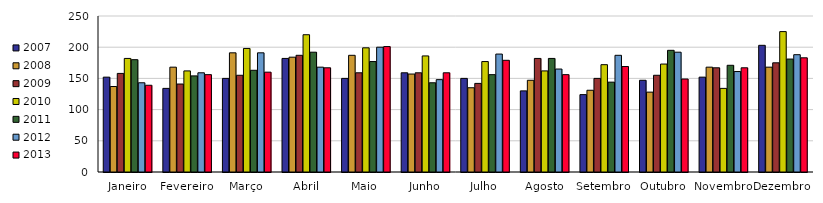
| Category | 2007 | 2008 | 2009 | 2010 | 2011 | 2012 | 2013 |
|---|---|---|---|---|---|---|---|
| Janeiro | 152 | 137 | 158 | 182 | 180 | 143 | 139 |
| Fevereiro | 134 | 168 | 141 | 162 | 154 | 159 | 156 |
| Março | 150 | 191 | 155 | 198 | 163 | 191 | 160 |
| Abril | 182 | 184 | 187 | 220 | 192 | 168 | 167 |
| Maio | 150 | 187 | 159 | 199 | 177 | 200 | 201 |
| Junho | 159 | 157 | 159 | 186 | 143 | 148 | 159 |
| Julho | 150 | 135 | 142 | 177 | 156 | 189 | 179 |
| Agosto | 130 | 147 | 182 | 162 | 182 | 165 | 156 |
| Setembro | 124 | 131 | 150 | 172 | 144 | 187 | 169 |
| Outubro | 147 | 128 | 155 | 173 | 195 | 192 | 149 |
| Novembro | 152 | 168 | 167 | 134 | 171 | 161 | 167 |
| Dezembro | 203 | 168 | 175 | 225 | 181 | 188 | 183 |